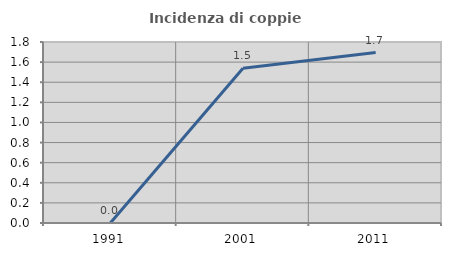
| Category | Incidenza di coppie miste |
|---|---|
| 1991.0 | 0 |
| 2001.0 | 1.538 |
| 2011.0 | 1.695 |